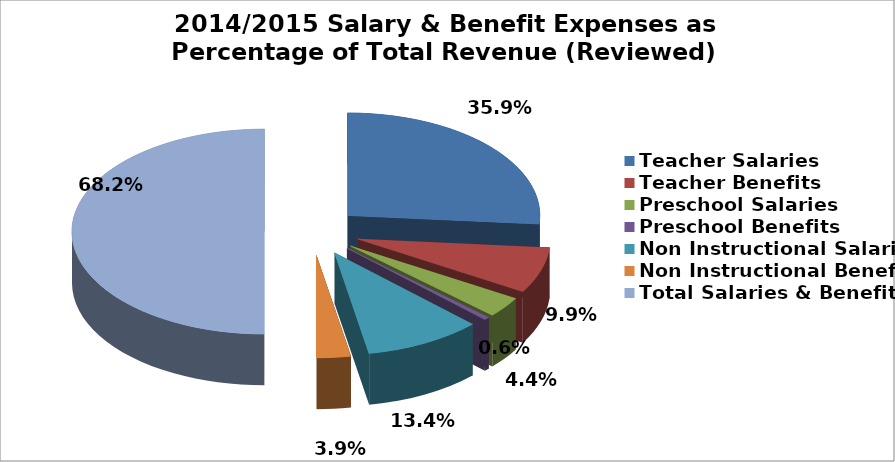
| Category | Series 0 |
|---|---|
| Teacher Salaries | 0.359 |
| Teacher Benefits | 0.099 |
| Preschool Salaries | 0.044 |
| Preschool Benefits | 0.006 |
| Non Instructional Salaries | 0.134 |
| Non Instructional Benefits | 0.039 |
| Total Salaries & Benefits | 0.682 |